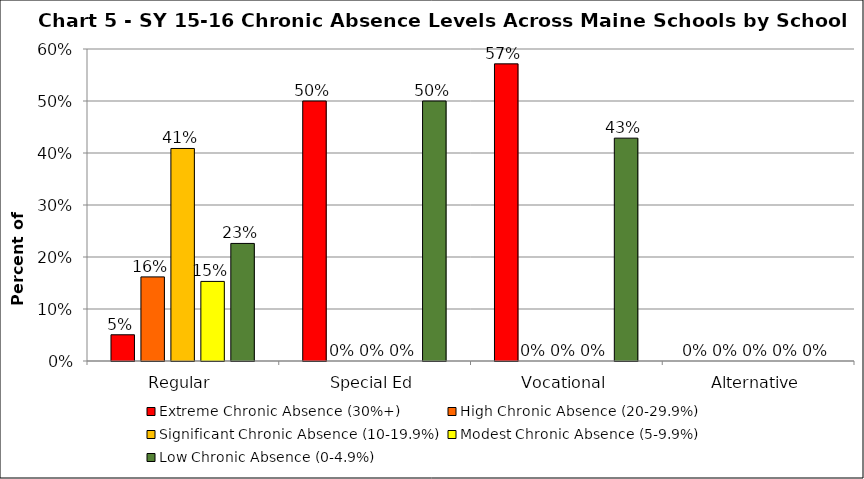
| Category | Extreme Chronic Absence (30%+) | High Chronic Absence (20-29.9%) | Significant Chronic Absence (10-19.9%) | Modest Chronic Absence (5-9.9%) | Low Chronic Absence (0-4.9%) |
|---|---|---|---|---|---|
| 0 | 0.05 | 0.162 | 0.409 | 0.153 | 0.226 |
| 1 | 0.5 | 0 | 0 | 0 | 0.5 |
| 2 | 0.571 | 0 | 0 | 0 | 0.429 |
| 3 | 0 | 0 | 0 | 0 | 0 |